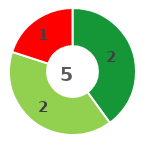
| Category | Series 0 |
|---|---|
| 0 | 2 |
| 1 | 2 |
| 2 | 0 |
| 3 | 1 |
| 4 | 0 |